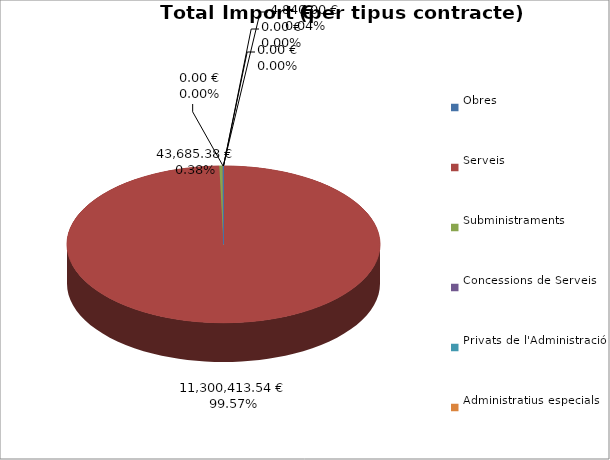
| Category | Total preu
(amb IVA) |
|---|---|
| Obres | 0 |
| Serveis | 11300413.54 |
| Subministraments | 43685.38 |
| Concessions de Serveis | 0 |
| Privats de l'Administració | 4840 |
| Administratius especials | 0 |